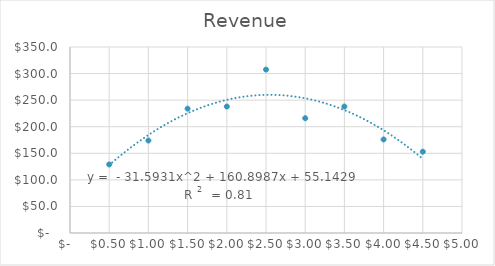
| Category | Revenue |
|---|---|
| 4.5 | 153 |
| 4.0 | 176 |
| 3.5 | 238 |
| 3.0 | 216 |
| 2.5 | 307.5 |
| 2.0 | 238 |
| 1.5 | 234 |
| 1.0 | 174 |
| 0.5 | 129 |